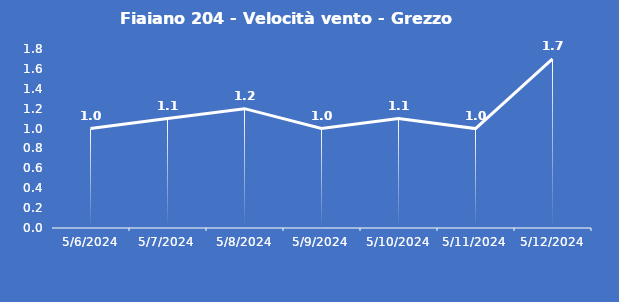
| Category | Fiaiano 204 - Velocità vento - Grezzo (m/s) |
|---|---|
| 5/6/24 | 1 |
| 5/7/24 | 1.1 |
| 5/8/24 | 1.2 |
| 5/9/24 | 1 |
| 5/10/24 | 1.1 |
| 5/11/24 | 1 |
| 5/12/24 | 1.7 |